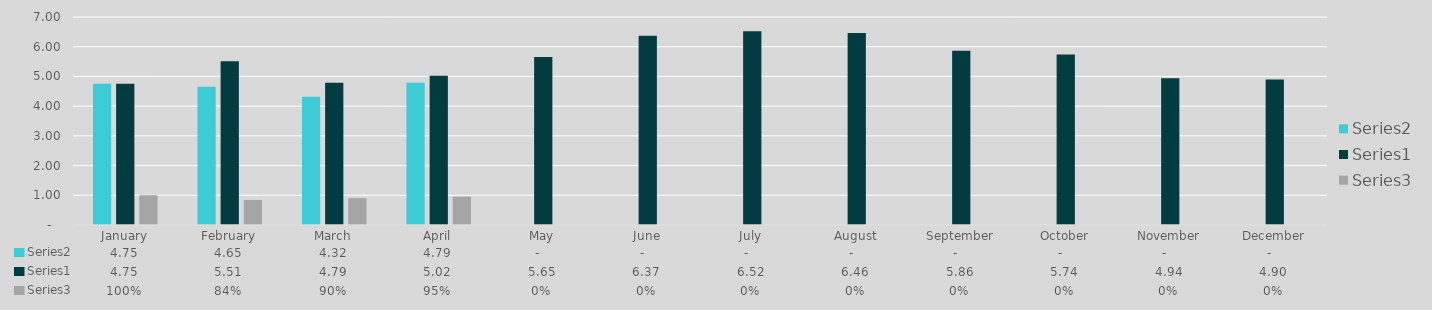
| Category | Series 1 | Series 0 | Series 2 |
|---|---|---|---|
| January | 4.75 | 4.75 | 1 |
| February | 4.65 | 5.51 | 0.844 |
| March | 4.32 | 4.79 | 0.902 |
| April | 4.79 | 5.02 | 0.954 |
| May | 0 | 5.65 | 0 |
| June | 0 | 6.37 | 0 |
| July | 0 | 6.52 | 0 |
| August | 0 | 6.46 | 0 |
| September | 0 | 5.86 | 0 |
| October | 0 | 5.74 | 0 |
| November | 0 | 4.94 | 0 |
| December | 0 | 4.9 | 0 |